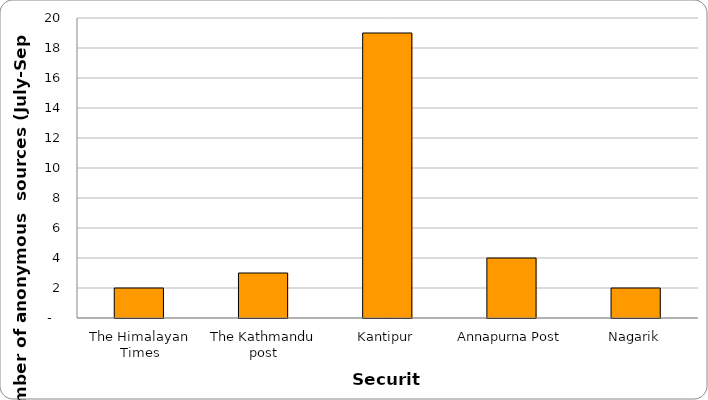
| Category | Security |
|---|---|
| The Himalayan Times | 2 |
| The Kathmandu post | 3 |
| Kantipur | 19 |
| Annapurna Post | 4 |
| Nagarik | 2 |